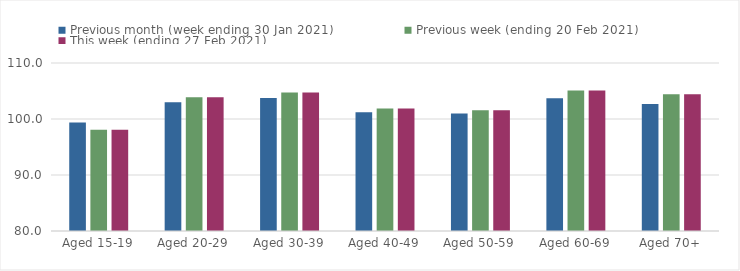
| Category | Previous month (week ending 30 Jan 2021) | Previous week (ending 20 Feb 2021) | This week (ending 27 Feb 2021) |
|---|---|---|---|
| Aged 15-19 | 99.36 | 98.09 | 98.09 |
| Aged 20-29 | 102.97 | 103.89 | 103.89 |
| Aged 30-39 | 103.74 | 104.75 | 104.75 |
| Aged 40-49 | 101.21 | 101.87 | 101.87 |
| Aged 50-59 | 100.98 | 101.55 | 101.55 |
| Aged 60-69 | 103.72 | 105.07 | 105.07 |
| Aged 70+ | 102.66 | 104.42 | 104.42 |